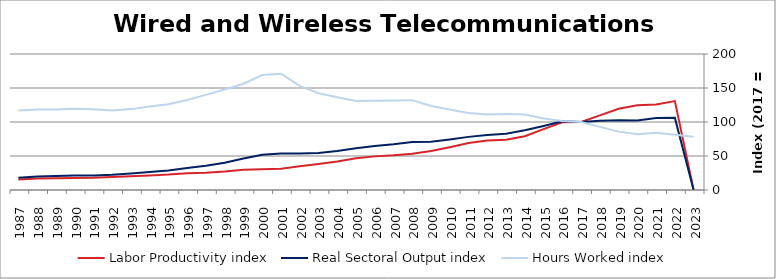
| Category | Labor Productivity index | Real Sectoral Output index | Hours Worked index |
|---|---|---|---|
| 2023.0 | 0 | 0 | 78.196 |
| 2022.0 | 130.782 | 106.056 | 81.093 |
| 2021.0 | 125.758 | 105.773 | 84.108 |
| 2020.0 | 124.67 | 102.092 | 81.89 |
| 2019.0 | 119.386 | 102.498 | 85.854 |
| 2018.0 | 109.69 | 101.809 | 92.815 |
| 2017.0 | 100 | 100 | 100 |
| 2016.0 | 99.622 | 101.008 | 101.391 |
| 2015.0 | 89.526 | 94.094 | 105.102 |
| 2014.0 | 79.036 | 87.801 | 111.089 |
| 2013.0 | 73.873 | 82.61 | 111.827 |
| 2012.0 | 72.769 | 80.917 | 111.197 |
| 2011.0 | 69.034 | 78.127 | 113.172 |
| 2010.0 | 62.895 | 74.414 | 118.314 |
| 2009.0 | 57.299 | 70.844 | 123.639 |
| 2008.0 | 53.382 | 70.551 | 132.162 |
| 2007.0 | 51.092 | 67.222 | 131.57 |
| 2006.0 | 49.451 | 64.861 | 131.163 |
| 2005.0 | 46.757 | 61.248 | 130.994 |
| 2004.0 | 41.973 | 57.216 | 136.315 |
| 2003.0 | 38.237 | 54.383 | 142.227 |
| 2002.0 | 35.039 | 53.667 | 153.161 |
| 2001.0 | 31.425 | 53.71 | 170.914 |
| 2000.0 | 30.676 | 51.839 | 168.987 |
| 1999.0 | 29.647 | 46.311 | 156.211 |
| 1998.0 | 27.184 | 40.201 | 147.883 |
| 1997.0 | 25.455 | 35.602 | 139.862 |
| 1996.0 | 24.526 | 32.46 | 132.35 |
| 1995.0 | 22.665 | 28.556 | 125.988 |
| 1994.0 | 21.503 | 26.375 | 122.656 |
| 1993.0 | 20.294 | 24.139 | 118.945 |
| 1992.0 | 19.22 | 22.49 | 117.016 |
| 1991.0 | 18.115 | 21.487 | 118.616 |
| 1990.0 | 17.744 | 21.201 | 119.484 |
| 1989.0 | 17.384 | 20.594 | 118.47 |
| 1988.0 | 16.905 | 20.009 | 118.359 |
| 1987.0 | 15.462 | 18.068 | 116.855 |